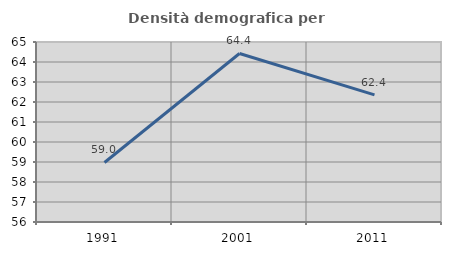
| Category | Densità demografica |
|---|---|
| 1991.0 | 58.977 |
| 2001.0 | 64.426 |
| 2011.0 | 62.357 |